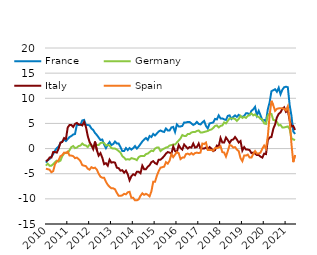
| Category | France | Germany | Italy | Spain |
|---|---|---|---|---|
| 2010-01-31 | -2.8 | -3.4 | -2.5 | -4 |
| 2010-02-28 | -2.3 | -3 | -2.3 | -4.1 |
| 2010-03-31 | -2.1 | -3.4 | -1.8 | -4.2 |
| 2010-04-30 | -1.6 | -3.4 | -1.8 | -4.7 |
| 2010-05-31 | -1.1 | -3.1 | -0.7 | -4.5 |
| 2010-06-30 | -0.4 | -2.7 | -0.7 | -3.1 |
| 2010-07-31 | 0.1 | -2.4 | -0.8 | -2.6 |
| 2010-08-31 | 0.4 | -2.6 | 0 | -2.3 |
| 2010-09-30 | 1.1 | -2.4 | 1.2 | -1.5 |
| 2010-10-31 | 1.4 | -1.5 | 1.3 | -1.3 |
| 2010-11-30 | 1.8 | -1 | 2.1 | -0.8 |
| 2010-12-31 | 1.5 | -0.8 | 1.9 | -0.9 |
| 2011-01-31 | 1.9 | -0.9 | 4.2 | -0.6 |
| 2011-02-28 | 2.3 | -0.3 | 4.7 | -1.4 |
| 2011-03-31 | 2.5 | 0.3 | 4.7 | -1.4 |
| 2011-04-30 | 2.8 | 0.5 | 4.3 | -1.5 |
| 2011-05-31 | 2.9 | 0.1 | 4.9 | -1.9 |
| 2011-06-30 | 4.7 | 0.2 | 5.1 | -1.8 |
| 2011-07-31 | 4.7 | 0.5 | 4.8 | -2.1 |
| 2011-08-31 | 4.7 | 0.6 | 4.8 | -2.5 |
| 2011-09-30 | 5.6 | 1 | 4.6 | -3.3 |
| 2011-10-31 | 5.7 | 0.7 | 5.3 | -3.4 |
| 2011-11-30 | 4.7 | 0.6 | 4.3 | -3.5 |
| 2011-12-31 | 4.7 | 0.3 | 2.5 | -4 |
| 2012-01-31 | 4.6 | 0.8 | 1.3 | -4.2 |
| 2012-02-29 | 4 | 0.5 | 0.7 | -3.7 |
| 2012-03-31 | 3.7 | 0.4 | -0.1 | -3.9 |
| 2012-04-30 | 3.1 | 0.4 | 1.4 | -3.8 |
| 2012-05-31 | 2.7 | 0.7 | -0.3 | -4.2 |
| 2012-06-30 | 2.2 | 0.7 | -1.4 | -5 |
| 2012-07-31 | 1.7 | 1.1 | -0.9 | -5.6 |
| 2012-08-31 | 1.8 | 1.2 | -1.8 | -5.8 |
| 2012-09-30 | 0.8 | 1.1 | -3.1 | -5.8 |
| 2012-10-31 | 0.1 | 0.6 | -2.9 | -6.6 |
| 2012-11-30 | 0.8 | 0.7 | -3.4 | -7.2 |
| 2012-12-31 | 1.3 | 0.6 | -2.2 | -7.6 |
| 2013-01-31 | 0.7 | 0.1 | -2.8 | -7.9 |
| 2013-02-28 | 0.9 | 0 | -2.7 | -7.9 |
| 2013-03-31 | 1.4 | 0 | -2.8 | -8.1 |
| 2013-04-30 | 1 | -0.2 | -3.8 | -8.8 |
| 2013-05-31 | 1 | -0.5 | -3.9 | -9.4 |
| 2013-06-30 | 0.3 | -0.8 | -4.4 | -9.4 |
| 2013-07-31 | -0.5 | -1.5 | -4.3 | -9.3 |
| 2013-08-31 | -0.5 | -1.8 | -4.8 | -9 |
| 2013-09-30 | 0.1 | -2.2 | -4.4 | -9.1 |
| 2013-10-31 | -0.3 | -2.1 | -5.1 | -8.7 |
| 2013-11-30 | 0.1 | -2.2 | -6.3 | -8.6 |
| 2013-12-31 | -0.2 | -1.9 | -5.5 | -9.8 |
| 2014-01-31 | 0.1 | -2 | -5.1 | -9.8 |
| 2014-02-28 | 0.5 | -2.1 | -5.3 | -10.3 |
| 2014-03-31 | 0 | -2.3 | -4.6 | -10.3 |
| 2014-04-30 | 0.4 | -1.7 | -4.6 | -10.1 |
| 2014-05-31 | 0.9 | -1.5 | -4.9 | -9.4 |
| 2014-06-30 | 1.4 | -1.5 | -3.4 | -8.9 |
| 2014-07-31 | 1.8 | -1.5 | -4.1 | -9.2 |
| 2014-08-31 | 2.1 | -1.1 | -4.1 | -9 |
| 2014-09-30 | 1.7 | -1 | -3.6 | -9.2 |
| 2014-10-31 | 2.5 | -0.7 | -3.3 | -9.5 |
| 2014-11-30 | 2.3 | -0.4 | -2.7 | -8.5 |
| 2014-12-31 | 2.9 | -0.5 | -2.5 | -6.6 |
| 2015-01-31 | 2.6 | 0 | -2.9 | -6.6 |
| 2015-02-28 | 3 | 0.2 | -3.1 | -5.4 |
| 2015-03-31 | 3.4 | 0.2 | -2.2 | -4.5 |
| 2015-04-30 | 3.6 | -0.5 | -2.2 | -3.8 |
| 2015-05-31 | 3.4 | -0.2 | -1.9 | -3.7 |
| 2015-06-30 | 3.3 | 0 | -1.5 | -3.6 |
| 2015-07-31 | 4 | 0.2 | -1 | -2.7 |
| 2015-08-31 | 3.6 | 0.3 | -0.7 | -3 |
| 2015-09-30 | 3.6 | 0.6 | -0.8 | -2.4 |
| 2015-10-31 | 4.2 | 0.7 | -1 | -1.1 |
| 2015-11-30 | 4.3 | 0.8 | 0.4 | -1.7 |
| 2015-12-31 | 3.3 | 0.8 | -0.5 | -1.2 |
| 2016-01-31 | 4.8 | 1.2 | -0.7 | -0.7 |
| 2016-02-29 | 4.4 | 1.6 | 0.7 | -0.9 |
| 2016-03-31 | 4.4 | 2 | 0.1 | -2.1 |
| 2016-04-30 | 4.5 | 2.7 | -0.2 | -1.8 |
| 2016-05-31 | 5.2 | 2.5 | 0.8 | -1.8 |
| 2016-06-30 | 5.2 | 2.5 | 0.4 | -1.1 |
| 2016-07-31 | 5.3 | 2.9 | 0 | -1 |
| 2016-08-31 | 5.3 | 2.9 | 0.3 | -1.2 |
| 2016-09-30 | 5 | 3.2 | 0.2 | -0.9 |
| 2016-10-31 | 4.7 | 3.3 | 1 | -1.2 |
| 2016-11-30 | 4.9 | 3.3 | 0.2 | -0.9 |
| 2016-12-31 | 5.3 | 3.5 | 0.3 | -0.8 |
| 2017-01-31 | 4.9 | 3.6 | 1 | -0.9 |
| 2017-02-28 | 4.8 | 3.2 | 0 | -0.8 |
| 2017-03-31 | 5.2 | 3.2 | 0 | 1 |
| 2017-04-30 | 5.5 | 3.3 | 0 | 0.9 |
| 2017-05-31 | 4.5 | 3.4 | 0.2 | 1.2 |
| 2017-06-30 | 4 | 3.5 | -0.1 | -0.3 |
| 2017-07-31 | 5 | 3.7 | 0.3 | -0.3 |
| 2017-08-31 | 5.1 | 3.8 | 0 | -0.3 |
| 2017-09-30 | 5.2 | 4.1 | -0.5 | -0.4 |
| 2017-10-31 | 5.9 | 4.5 | -0.3 | 0.1 |
| 2017-11-30 | 5.8 | 4.6 | 0.6 | 0.1 |
| 2017-12-31 | 6.6 | 4.2 | 0.4 | 0.2 |
| 2018-01-31 | 6 | 4.5 | 2.1 | 0.5 |
| 2018-02-28 | 6 | 4.6 | 1.2 | -0.7 |
| 2018-03-31 | 5.8 | 5.2 | 1.2 | -0.8 |
| 2018-04-30 | 5.7 | 5 | 2.2 | -1.6 |
| 2018-05-31 | 6.5 | 5.5 | 1.7 | -0.5 |
| 2018-06-30 | 6.6 | 6 | 1.1 | 0.7 |
| 2018-07-31 | 5.9 | 6 | 1.7 | 0.6 |
| 2018-08-31 | 6.3 | 6 | 1.8 | 0.2 |
| 2018-09-30 | 6.6 | 5.9 | 2.3 | 0.3 |
| 2018-10-31 | 6.3 | 5.5 | 1.8 | -0.2 |
| 2018-11-30 | 6.7 | 5.9 | 1.2 | -0.5 |
| 2018-12-31 | 6.4 | 6.5 | 1.5 | -1.9 |
| 2019-01-31 | 6.3 | 6.1 | -0.4 | -2.5 |
| 2019-02-28 | 6.5 | 6.3 | 0.3 | -1.4 |
| 2019-03-31 | 7 | 6.1 | -0.2 | -1.4 |
| 2019-04-30 | 7 | 6.5 | -0.2 | -1.2 |
| 2019-05-31 | 6.7 | 6.7 | -0.3 | -1.8 |
| 2019-06-30 | 7.5 | 7 | -0.9 | -1.8 |
| 2019-07-31 | 7.8 | 6.6 | -0.8 | -1.1 |
| 2019-08-31 | 8.3 | 6.8 | -1 | -0.5 |
| 2019-09-30 | 6.6 | 6.4 | -1.3 | -1 |
| 2019-10-31 | 7.5 | 6.3 | -1.3 | -1 |
| 2019-11-30 | 6.6 | 5.9 | -1.6 | -0.8 |
| 2019-12-31 | 5.6 | 5.8 | -1.8 | 0 |
| 2020-01-31 | 5.7 | 5 | -1 | 0.6 |
| 2020-02-29 | 5.4 | 4.9 | -1.1 | 0 |
| 2020-03-31 | 7.8 | 6.6 | 1.7 | 2.4 |
| 2020-04-30 | 9.2 | 7 | 2.2 | 6.6 |
| 2020-05-31 | 11.4 | 6.9 | 2.3 | 9.5 |
| 2020-06-30 | 11.6 | 5.7 | 3.9 | 8.6 |
| 2020-07-31 | 11.8 | 5.6 | 4.8 | 7.5 |
| 2020-08-31 | 11.3 | 5.3 | 6.2 | 7.9 |
| 2020-09-30 | 12.1 | 4.6 | 6.9 | 8 |
| 2020-10-31 | 10.8 | 4.7 | 7.2 | 8 |
| 2020-11-30 | 11.7 | 4.2 | 7.9 | 8 |
| 2020-12-31 | 12.2 | 4.2 | 8.2 | 7.9 |
| 2021-01-31 | 12.3 | 4.3 | 7.3 | 7.6 |
| 2021-02-28 | 12.2 | 4.4 | 7.6 | 8.4 |
| 2021-03-31 | 8.7 | 3.9 | 5.6 | 5.8 |
| 2021-04-30 | 6.5 | 2.1 | 4.4 | 0.9 |
| 2021-05-31 | 3.4 | 1.8 | 4.5 | -2.7 |
| 2021-06-30 | 2.9 | 1.7 | 3.7 | -1.3 |